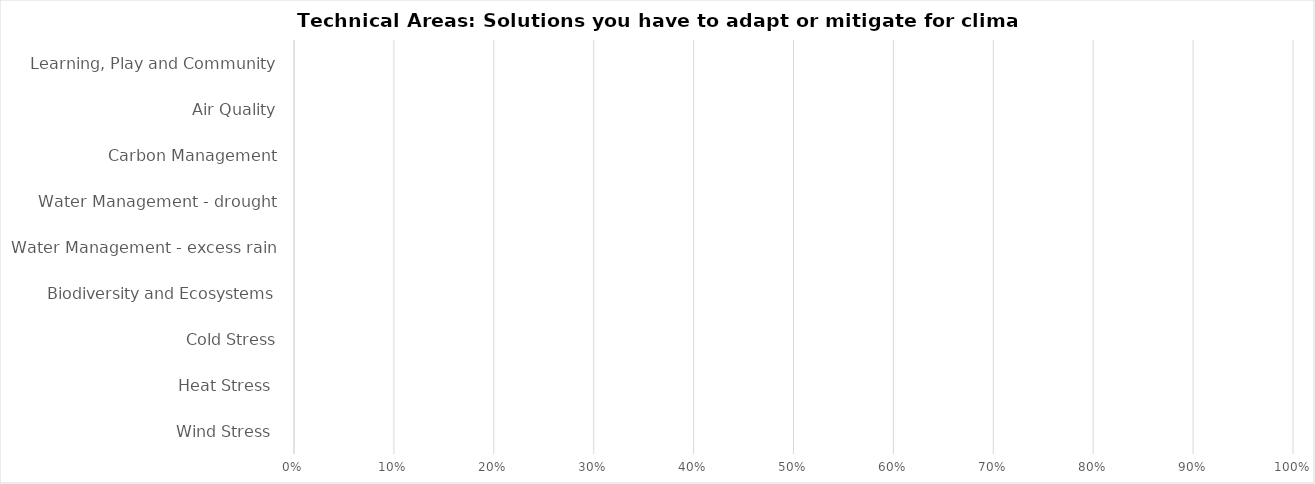
| Category | Series 0 |
|---|---|
| Wind Stress  | 0 |
| Heat Stress  | 0 |
| Cold Stress | 0 |
| Biodiversity and Ecosystems | 0 |
| Water Management - excess rain | 0 |
| Water Management - drought | 0 |
| Carbon Management | 0 |
| Air Quality | 0 |
| Learning, Play and Community | 0 |